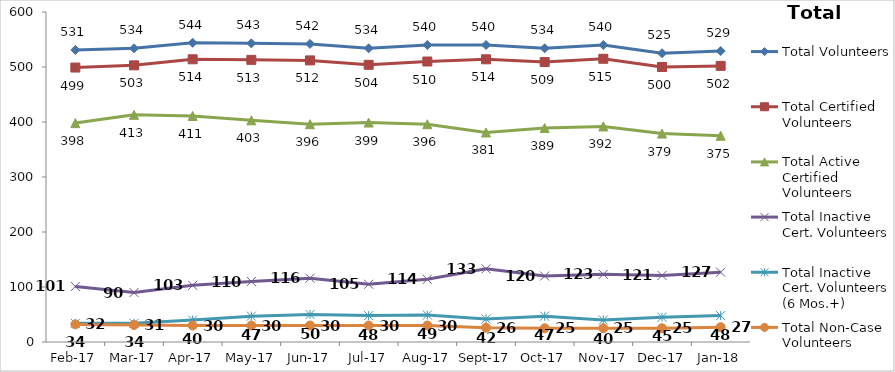
| Category | Total Volunteers | Total Certified Volunteers | Total Active Certified Volunteers | Total Inactive Cert. Volunteers | Total Inactive Cert. Volunteers (6 Mos.+) | Total Non-Case Volunteers |
|---|---|---|---|---|---|---|
| 2017-02-01 | 531 | 499 | 398 | 101 | 34 | 32 |
| 2017-03-01 | 534 | 503 | 413 | 90 | 34 | 31 |
| 2017-04-01 | 544 | 514 | 411 | 103 | 40 | 30 |
| 2017-05-01 | 543 | 513 | 403 | 110 | 47 | 30 |
| 2017-06-01 | 542 | 512 | 396 | 116 | 50 | 30 |
| 2017-07-01 | 534 | 504 | 399 | 105 | 48 | 30 |
| 2017-08-01 | 540 | 510 | 396 | 114 | 49 | 30 |
| 2017-09-01 | 540 | 514 | 381 | 133 | 42 | 26 |
| 2017-10-01 | 534 | 509 | 389 | 120 | 47 | 25 |
| 2017-11-01 | 540 | 515 | 392 | 123 | 40 | 25 |
| 2017-12-01 | 525 | 500 | 379 | 121 | 45 | 25 |
| 2018-01-01 | 529 | 502 | 375 | 127 | 48 | 27 |